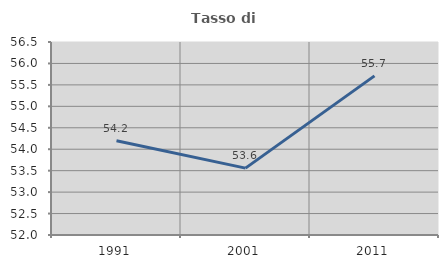
| Category | Tasso di occupazione   |
|---|---|
| 1991.0 | 54.198 |
| 2001.0 | 53.559 |
| 2011.0 | 55.71 |